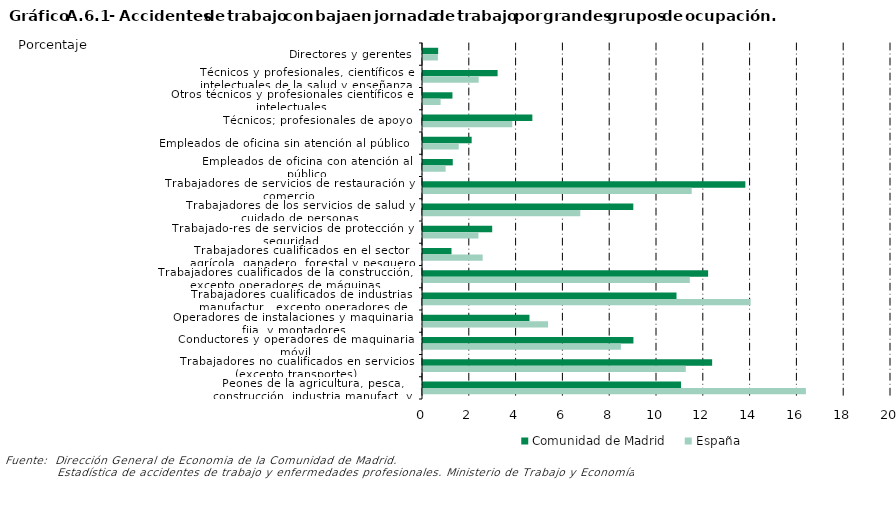
| Category | Comunidad de Madrid | España |
|---|---|---|
| Directores y gerentes | 0.648 | 0.636 |
| Técnicos y profesionales, científicos e intelectuales de la salud y enseñanza | 3.188 | 2.38 |
| Otros técnicos y profesionales científicos e intelectuales | 1.259 | 0.753 |
| Técnicos; profesionales de apoyo | 4.673 | 3.813 |
| Empleados de oficina sin atención al público | 2.079 | 1.528 |
| Empleados de oficina con atención al público | 1.272 | 0.967 |
| Trabajadores de servicios de restauración y comercio | 13.776 | 11.483 |
| Trabajadores de los servicios de salud y cuidado de personas | 8.987 | 6.722 |
| Trabajado-res de servicios de protección y seguridad  | 2.957 | 2.37 |
| Trabajadores cualificados en el sector agrícola, ganadero, forestal y pesquero | 1.218 | 2.55 |
| Trabajadores cualificados de la construcción, excepto operadores de máquinas | 12.185 | 11.405 |
| Trabajadores cualificados de industrias manufactur., excepto operadores de instalaciones y máquinas | 10.833 | 13.996 |
| Operadores de instalaciones y maquinaria fija, y montadores | 4.55 | 5.345 |
| Conductores y operadores de maquinaria móvil | 8.992 | 8.458 |
| Trabajadores no cualificados en servicios (excepto transportes) | 12.356 | 11.231 |
| Peones de la agricultura, pesca, construcción, industria manufact. y transporte | 11.027 | 16.364 |